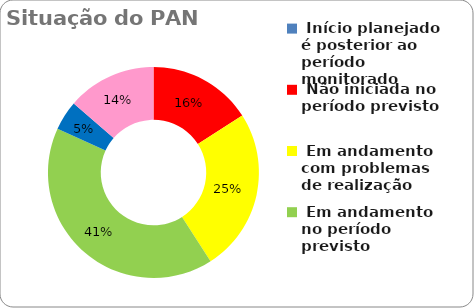
| Category | Series 0 |
|---|---|
|  Início planejado é posterior ao período monitorado | 0 |
|  Não iniciada no período previsto | 0.159 |
|  Em andamento com problemas de realização | 0.25 |
|  Em andamento no período previsto  | 0.409 |
|  Concluída | 0.045 |
|  Ações Novas - Pós monitoria | 0.136 |